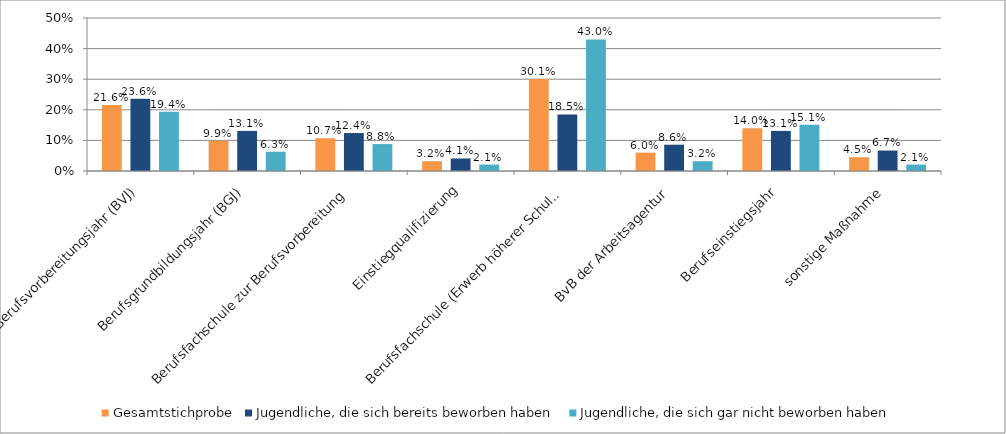
| Category | Gesamtstichprobe | Jugendliche, die sich bereits beworben haben | Jugendliche, die sich gar nicht beworben haben |
|---|---|---|---|
| Berufsvorbereitungsjahr (BVJ) | 21.6 | 23.6 | 19.4 |
| Berufsgrundbildungsjahr (BGJ) | 9.9 | 13.1 | 6.3 |
| Berufsfachschule zur Berufsvorbereitung | 10.7 | 12.4 | 8.8 |
| Einstiegqualifizierung | 3.2 | 4.1 | 2.1 |
| Berufsfachschule (Erwerb höherer Schulabschluss) | 30.1 | 18.5 | 43 |
| BvB der Arbeitsagentur | 6 | 8.6 | 3.2 |
| Berufseinstiegsjahr | 14 | 13.1 | 15.1 |
| sonstige Maßnahme | 4.5 | 6.7 | 2.1 |